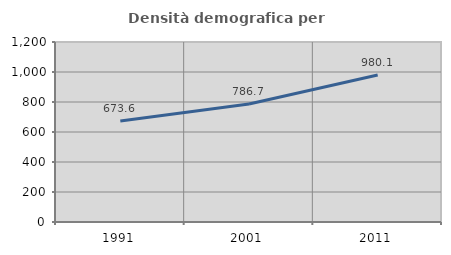
| Category | Densità demografica |
|---|---|
| 1991.0 | 673.639 |
| 2001.0 | 786.716 |
| 2011.0 | 980.067 |